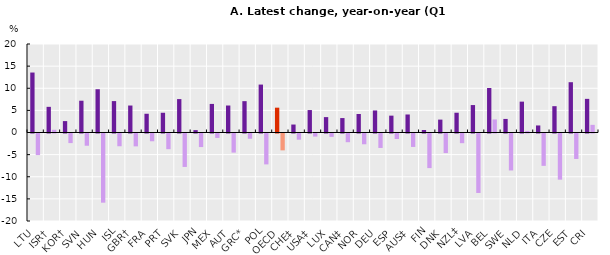
| Category | Nominal hourly wage | Real hourly wage |
|---|---|---|
| LTU | 13.552 | -4.882 |
| ISR† | 5.798 | 0.612 |
| KOR† | 2.577 | -2.166 |
| SVN | 7.183 | -2.766 |
| HUN | 9.777 | -15.632 |
| ISL | 7.099 | -2.883 |
| GBR† | 6.096 | -2.909 |
| FRA | 4.235 | -1.755 |
| PRT | 4.462 | -3.547 |
| SVK | 7.551 | -7.557 |
| JPN | 0.54 | -3.065 |
| MEX | 6.46 | -0.997 |
| AUT | 6.099 | -4.316 |
| GRC* | 7.084 | -1.188 |
| POL | 10.832 | -6.979 |
| OECD | 5.61 | -3.81 |
| CHE‡ | 1.8 | -1.399 |
| USA‡ | 5.072 | -0.697 |
| LUX | 3.477 | -0.762 |
| CAN‡ | 3.262 | -1.967 |
| NOR | 4.183 | -2.434 |
| DEU | 4.98 | -3.267 |
| ESP | 3.809 | -1.245 |
| AUS‡ | 4.071 | -3.037 |
| FIN | 0.57 | -7.819 |
| DNK | 2.913 | -4.422 |
| NZL‡ | 4.467 | -2.188 |
| LVA | 6.201 | -13.44 |
| BEL | 10.057 | 2.95 |
| SWE | 3.065 | -8.353 |
| NLD | 6.974 | 0.355 |
| ITA | 1.592 | -7.31 |
| CZE | 5.949 | -10.432 |
| EST | 11.368 | -5.755 |
| CRI | 7.601 | 1.729 |